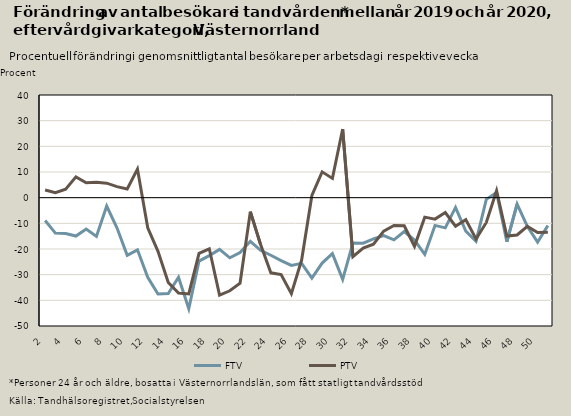
| Category | FTV | PTV |
|---|---|---|
| 2.0 | -8.911 | 3.015 |
| 3.0 | -13.818 | 1.931 |
| 4.0 | -13.959 | 3.295 |
| 5.0 | -14.946 | 8.087 |
| 6.0 | -12.206 | 5.815 |
| 7.0 | -15.086 | 5.958 |
| 8.0 | -3.286 | 5.65 |
| 9.0 | -11.731 | 4.313 |
| 10.0 | -22.453 | 3.406 |
| 11.0 | -20.329 | 11.14 |
| 12.0 | -31.05 | -11.728 |
| 13.0 | -37.56 | -20.92 |
| 14.0 | -37.341 | -33.038 |
| 15.0 | -31.027 | -37.186 |
| 16.0 | -43.311 | -37.505 |
| 17.0 | -24.698 | -21.663 |
| 18.0 | -22.585 | -19.909 |
| 19.0 | -20.16 | -37.969 |
| 20.0 | -23.44 | -36.283 |
| 21.0 | -21.368 | -33.278 |
| 22.0 | -17 | -5.459 |
| 23.0 | -20.499 | -18.292 |
| 24.0 | -22.442 | -29.279 |
| 25.0 | -24.512 | -29.946 |
| 26.0 | -26.376 | -37.415 |
| 27.0 | -25.602 | -24.309 |
| 28.0 | -31.374 | 0.87 |
| 29.0 | -25.478 | 10.063 |
| 30.0 | -21.826 | 7.5 |
| 31.0 | -31.802 | 26.733 |
| 32.0 | -17.665 | -22.974 |
| 33.0 | -17.749 | -19.605 |
| 34.0 | -16.058 | -18.124 |
| 35.0 | -14.796 | -13.033 |
| 36.0 | -16.45 | -10.827 |
| 37.0 | -13.177 | -10.973 |
| 38.0 | -16.521 | -18.963 |
| 39.0 | -22.1 | -7.587 |
| 40.0 | -10.811 | -8.361 |
| 41.0 | -11.761 | -5.819 |
| 42.0 | -3.806 | -11.125 |
| 43.0 | -13.023 | -8.562 |
| 44.0 | -17.012 | -16.092 |
| 45.0 | -0.642 | -9.656 |
| 46.0 | 2.033 | 2.708 |
| 47.0 | -17.195 | -14.964 |
| 48.0 | -2.497 | -14.52 |
| 49.0 | -11.192 | -11.202 |
| 50.0 | -17.329 | -13.541 |
| 51.0 | -10.856 | -13.482 |